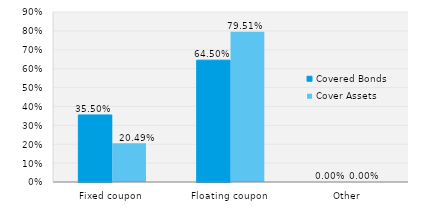
| Category | Covered Bonds | Cover Assets |
|---|---|---|
| Fixed coupon | 0.355 | 0.205 |
| Floating coupon | 0.645 | 0.795 |
| Other | 0 | 0 |